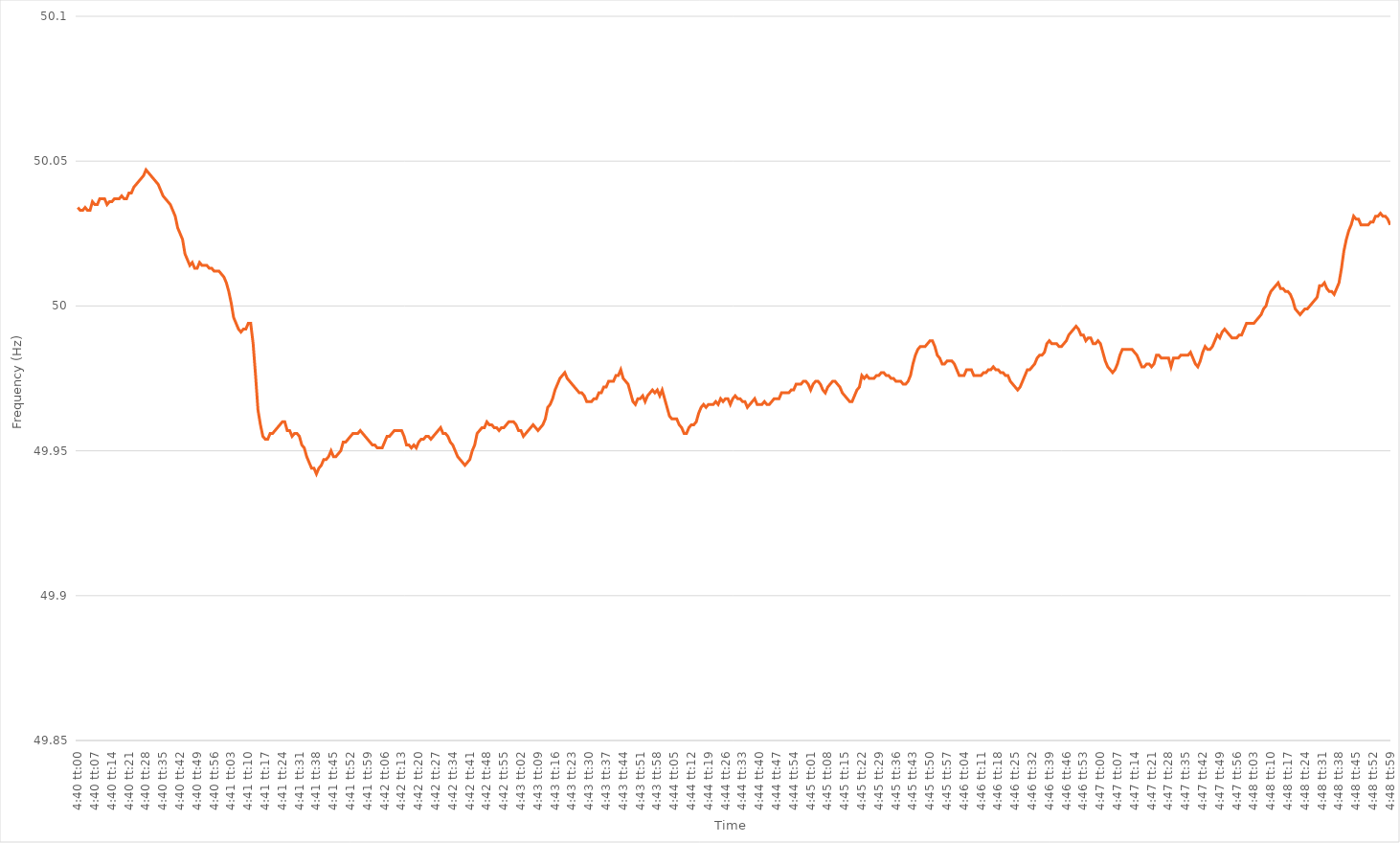
| Category | Series 0 |
|---|---|
| 0.19444444444444445 | 50.034 |
| 0.19445601851851854 | 50.033 |
| 0.19446759259259258 | 50.033 |
| 0.19447916666666668 | 50.034 |
| 0.19449074074074071 | 50.033 |
| 0.19450231481481484 | 50.033 |
| 0.19451388888888888 | 50.036 |
| 0.19452546296296294 | 50.035 |
| 0.19453703703703704 | 50.035 |
| 0.1945486111111111 | 50.037 |
| 0.19456018518518517 | 50.037 |
| 0.19457175925925926 | 50.037 |
| 0.19458333333333333 | 50.035 |
| 0.1945949074074074 | 50.036 |
| 0.1946064814814815 | 50.036 |
| 0.19461805555555556 | 50.037 |
| 0.19462962962962962 | 50.037 |
| 0.19464120370370372 | 50.037 |
| 0.19465277777777779 | 50.038 |
| 0.19466435185185185 | 50.037 |
| 0.19467592592592595 | 50.037 |
| 0.1946875 | 50.039 |
| 0.19469907407407408 | 50.039 |
| 0.19471064814814812 | 50.041 |
| 0.19472222222222224 | 50.042 |
| 0.19473379629629628 | 50.043 |
| 0.19474537037037035 | 50.044 |
| 0.19475694444444444 | 50.045 |
| 0.1947685185185185 | 50.047 |
| 0.19478009259259257 | 50.046 |
| 0.19479166666666667 | 50.045 |
| 0.19480324074074074 | 50.044 |
| 0.1948148148148148 | 50.043 |
| 0.1948263888888889 | 50.042 |
| 0.19483796296296296 | 50.04 |
| 0.19484953703703703 | 50.038 |
| 0.19486111111111112 | 50.037 |
| 0.1948726851851852 | 50.036 |
| 0.19488425925925926 | 50.035 |
| 0.19489583333333335 | 50.033 |
| 0.19490740740740742 | 50.031 |
| 0.19491898148148148 | 50.027 |
| 0.19493055555555558 | 50.025 |
| 0.19494212962962965 | 50.023 |
| 0.19495370370370368 | 50.018 |
| 0.1949652777777778 | 50.016 |
| 0.19497685185185185 | 50.014 |
| 0.1949884259259259 | 50.015 |
| 0.19499999999999998 | 50.013 |
| 0.19501157407407407 | 50.013 |
| 0.19502314814814814 | 50.015 |
| 0.1950347222222222 | 50.014 |
| 0.1950462962962963 | 50.014 |
| 0.19505787037037037 | 50.014 |
| 0.19506944444444443 | 50.013 |
| 0.19508101851851853 | 50.013 |
| 0.1950925925925926 | 50.012 |
| 0.19510416666666666 | 50.012 |
| 0.19511574074074076 | 50.012 |
| 0.19512731481481482 | 50.011 |
| 0.1951388888888889 | 50.01 |
| 0.19515046296296298 | 50.008 |
| 0.19516203703703705 | 50.005 |
| 0.1951736111111111 | 50.001 |
| 0.1951851851851852 | 49.996 |
| 0.19519675925925925 | 49.994 |
| 0.19520833333333334 | 49.992 |
| 0.19521990740740738 | 49.991 |
| 0.19523148148148148 | 49.992 |
| 0.19524305555555554 | 49.992 |
| 0.1952546296296296 | 49.994 |
| 0.1952662037037037 | 49.994 |
| 0.19527777777777777 | 49.987 |
| 0.19528935185185184 | 49.976 |
| 0.19530092592592593 | 49.964 |
| 0.1953125 | 49.959 |
| 0.19532407407407407 | 49.955 |
| 0.19533564814814816 | 49.954 |
| 0.19534722222222223 | 49.954 |
| 0.1953587962962963 | 49.956 |
| 0.1953703703703704 | 49.956 |
| 0.19538194444444446 | 49.957 |
| 0.19539351851851852 | 49.958 |
| 0.19540509259259262 | 49.959 |
| 0.19541666666666666 | 49.96 |
| 0.19542824074074075 | 49.96 |
| 0.1954398148148148 | 49.957 |
| 0.1954513888888889 | 49.957 |
| 0.19546296296296295 | 49.955 |
| 0.19547453703703702 | 49.956 |
| 0.1954861111111111 | 49.956 |
| 0.19549768518518518 | 49.955 |
| 0.19550925925925924 | 49.952 |
| 0.19552083333333334 | 49.951 |
| 0.1955324074074074 | 49.948 |
| 0.19554398148148147 | 49.946 |
| 0.19555555555555557 | 49.944 |
| 0.19556712962962963 | 49.944 |
| 0.1955787037037037 | 49.942 |
| 0.1955902777777778 | 49.944 |
| 0.19560185185185186 | 49.945 |
| 0.19561342592592593 | 49.947 |
| 0.19562500000000002 | 49.947 |
| 0.1956365740740741 | 49.948 |
| 0.19564814814814815 | 49.95 |
| 0.1956597222222222 | 49.948 |
| 0.19567129629629632 | 49.948 |
| 0.19568287037037035 | 49.949 |
| 0.19569444444444442 | 49.95 |
| 0.19570601851851852 | 49.953 |
| 0.19571759259259258 | 49.953 |
| 0.19572916666666665 | 49.954 |
| 0.19574074074074074 | 49.955 |
| 0.1957523148148148 | 49.956 |
| 0.19576388888888888 | 49.956 |
| 0.19577546296296297 | 49.956 |
| 0.19578703703703704 | 49.957 |
| 0.1957986111111111 | 49.956 |
| 0.1958101851851852 | 49.955 |
| 0.19582175925925926 | 49.954 |
| 0.19583333333333333 | 49.953 |
| 0.19584490740740743 | 49.952 |
| 0.1958564814814815 | 49.952 |
| 0.19586805555555556 | 49.951 |
| 0.19587962962962965 | 49.951 |
| 0.19589120370370372 | 49.951 |
| 0.19590277777777776 | 49.953 |
| 0.19591435185185188 | 49.955 |
| 0.19592592592592592 | 49.955 |
| 0.1959375 | 49.956 |
| 0.19594907407407405 | 49.957 |
| 0.19596064814814815 | 49.957 |
| 0.19597222222222221 | 49.957 |
| 0.19598379629629628 | 49.957 |
| 0.19599537037037038 | 49.955 |
| 0.19600694444444444 | 49.952 |
| 0.1960185185185185 | 49.952 |
| 0.1960300925925926 | 49.951 |
| 0.19604166666666667 | 49.952 |
| 0.19605324074074074 | 49.951 |
| 0.19606481481481483 | 49.953 |
| 0.1960763888888889 | 49.954 |
| 0.19608796296296296 | 49.954 |
| 0.19609953703703706 | 49.955 |
| 0.19611111111111112 | 49.955 |
| 0.19612268518518516 | 49.954 |
| 0.19613425925925929 | 49.955 |
| 0.19614583333333332 | 49.956 |
| 0.19615740740740742 | 49.957 |
| 0.19616898148148146 | 49.958 |
| 0.19618055555555555 | 49.956 |
| 0.19619212962962962 | 49.956 |
| 0.19620370370370369 | 49.955 |
| 0.19621527777777778 | 49.953 |
| 0.19622685185185185 | 49.952 |
| 0.1962384259259259 | 49.95 |
| 0.19625 | 49.948 |
| 0.19626157407407407 | 49.947 |
| 0.19627314814814814 | 49.946 |
| 0.19628472222222224 | 49.945 |
| 0.1962962962962963 | 49.946 |
| 0.19630787037037037 | 49.947 |
| 0.19631944444444446 | 49.95 |
| 0.19633101851851853 | 49.952 |
| 0.1963425925925926 | 49.956 |
| 0.1963541666666667 | 49.957 |
| 0.19636574074074073 | 49.958 |
| 0.19637731481481482 | 49.958 |
| 0.19638888888888886 | 49.96 |
| 0.19640046296296299 | 49.959 |
| 0.19641203703703702 | 49.959 |
| 0.1964236111111111 | 49.958 |
| 0.19643518518518518 | 49.958 |
| 0.19644675925925925 | 49.957 |
| 0.19645833333333332 | 49.958 |
| 0.1964699074074074 | 49.958 |
| 0.19648148148148148 | 49.959 |
| 0.19649305555555555 | 49.96 |
| 0.19650462962962964 | 49.96 |
| 0.1965162037037037 | 49.96 |
| 0.19652777777777777 | 49.959 |
| 0.19653935185185187 | 49.957 |
| 0.19655092592592593 | 49.957 |
| 0.1965625 | 49.955 |
| 0.1965740740740741 | 49.956 |
| 0.19658564814814816 | 49.957 |
| 0.19659722222222223 | 49.958 |
| 0.19660879629629627 | 49.959 |
| 0.1966203703703704 | 49.958 |
| 0.19663194444444443 | 49.957 |
| 0.1966435185185185 | 49.958 |
| 0.1966550925925926 | 49.959 |
| 0.19666666666666666 | 49.961 |
| 0.19667824074074072 | 49.965 |
| 0.19668981481481482 | 49.966 |
| 0.19670138888888888 | 49.968 |
| 0.19671296296296295 | 49.971 |
| 0.19672453703703704 | 49.973 |
| 0.1967361111111111 | 49.975 |
| 0.19674768518518518 | 49.976 |
| 0.19675925925925927 | 49.977 |
| 0.19677083333333334 | 49.975 |
| 0.1967824074074074 | 49.974 |
| 0.1967939814814815 | 49.973 |
| 0.19680555555555557 | 49.972 |
| 0.19681712962962963 | 49.971 |
| 0.19682870370370367 | 49.97 |
| 0.1968402777777778 | 49.97 |
| 0.19685185185185183 | 49.969 |
| 0.19686342592592596 | 49.967 |
| 0.196875 | 49.967 |
| 0.19688657407407406 | 49.967 |
| 0.19689814814814813 | 49.968 |
| 0.19690972222222222 | 49.968 |
| 0.1969212962962963 | 49.97 |
| 0.19693287037037036 | 49.97 |
| 0.19694444444444445 | 49.972 |
| 0.19695601851851852 | 49.972 |
| 0.19696759259259258 | 49.974 |
| 0.19697916666666668 | 49.974 |
| 0.19699074074074074 | 49.974 |
| 0.1970023148148148 | 49.976 |
| 0.1970138888888889 | 49.976 |
| 0.19702546296296297 | 49.978 |
| 0.19703703703703704 | 49.975 |
| 0.19704861111111113 | 49.974 |
| 0.1970601851851852 | 49.973 |
| 0.19707175925925924 | 49.97 |
| 0.19708333333333336 | 49.967 |
| 0.1970949074074074 | 49.966 |
| 0.1971064814814815 | 49.968 |
| 0.19711805555555553 | 49.968 |
| 0.19712962962962963 | 49.969 |
| 0.1971412037037037 | 49.967 |
| 0.19715277777777776 | 49.969 |
| 0.19716435185185185 | 49.97 |
| 0.19717592592592592 | 49.971 |
| 0.1971875 | 49.97 |
| 0.19719907407407408 | 49.971 |
| 0.19721064814814815 | 49.969 |
| 0.19722222222222222 | 49.971 |
| 0.1972337962962963 | 49.968 |
| 0.19724537037037038 | 49.965 |
| 0.19725694444444444 | 49.962 |
| 0.19726851851851854 | 49.961 |
| 0.1972800925925926 | 49.961 |
| 0.19729166666666667 | 49.961 |
| 0.19730324074074077 | 49.959 |
| 0.1973148148148148 | 49.958 |
| 0.1973263888888889 | 49.956 |
| 0.19733796296296294 | 49.956 |
| 0.19734953703703703 | 49.958 |
| 0.1973611111111111 | 49.959 |
| 0.19737268518518516 | 49.959 |
| 0.19738425925925926 | 49.96 |
| 0.19739583333333333 | 49.963 |
| 0.1974074074074074 | 49.965 |
| 0.1974189814814815 | 49.966 |
| 0.19743055555555555 | 49.965 |
| 0.19744212962962962 | 49.966 |
| 0.19745370370370371 | 49.966 |
| 0.19746527777777778 | 49.966 |
| 0.19747685185185185 | 49.967 |
| 0.19748842592592594 | 49.966 |
| 0.1975 | 49.968 |
| 0.19751157407407408 | 49.967 |
| 0.19752314814814817 | 49.968 |
| 0.19753472222222224 | 49.968 |
| 0.1975462962962963 | 49.966 |
| 0.19755787037037034 | 49.968 |
| 0.19756944444444446 | 49.969 |
| 0.1975810185185185 | 49.968 |
| 0.19759259259259257 | 49.968 |
| 0.19760416666666666 | 49.967 |
| 0.19761574074074073 | 49.967 |
| 0.1976273148148148 | 49.965 |
| 0.1976388888888889 | 49.966 |
| 0.19765046296296296 | 49.967 |
| 0.19766203703703702 | 49.968 |
| 0.19767361111111112 | 49.966 |
| 0.19768518518518519 | 49.966 |
| 0.19769675925925925 | 49.966 |
| 0.19770833333333335 | 49.967 |
| 0.1977199074074074 | 49.966 |
| 0.19773148148148148 | 49.966 |
| 0.19774305555555557 | 49.967 |
| 0.19775462962962964 | 49.968 |
| 0.1977662037037037 | 49.968 |
| 0.19777777777777775 | 49.968 |
| 0.19778935185185187 | 49.97 |
| 0.1978009259259259 | 49.97 |
| 0.19781250000000003 | 49.97 |
| 0.19782407407407407 | 49.97 |
| 0.19783564814814814 | 49.971 |
| 0.1978472222222222 | 49.971 |
| 0.1978587962962963 | 49.973 |
| 0.19787037037037036 | 49.973 |
| 0.19788194444444443 | 49.973 |
| 0.19789351851851852 | 49.974 |
| 0.1979050925925926 | 49.974 |
| 0.19791666666666666 | 49.973 |
| 0.19792824074074075 | 49.971 |
| 0.19793981481481482 | 49.973 |
| 0.19795138888888889 | 49.974 |
| 0.19796296296296298 | 49.974 |
| 0.19797453703703705 | 49.973 |
| 0.1979861111111111 | 49.971 |
| 0.1979976851851852 | 49.97 |
| 0.19800925925925927 | 49.972 |
| 0.1980208333333333 | 49.973 |
| 0.19803240740740743 | 49.974 |
| 0.19804398148148147 | 49.974 |
| 0.19805555555555557 | 49.973 |
| 0.1980671296296296 | 49.972 |
| 0.1980787037037037 | 49.97 |
| 0.19809027777777777 | 49.969 |
| 0.19810185185185183 | 49.968 |
| 0.19811342592592593 | 49.967 |
| 0.198125 | 49.967 |
| 0.19813657407407406 | 49.969 |
| 0.19814814814814816 | 49.971 |
| 0.19815972222222222 | 49.972 |
| 0.1981712962962963 | 49.976 |
| 0.19818287037037038 | 49.975 |
| 0.19819444444444445 | 49.976 |
| 0.19820601851851852 | 49.975 |
| 0.1982175925925926 | 49.975 |
| 0.19822916666666668 | 49.975 |
| 0.19824074074074075 | 49.976 |
| 0.19825231481481484 | 49.976 |
| 0.19826388888888888 | 49.977 |
| 0.19827546296296297 | 49.977 |
| 0.198287037037037 | 49.976 |
| 0.1982986111111111 | 49.976 |
| 0.19831018518518517 | 49.975 |
| 0.19832175925925924 | 49.975 |
| 0.19833333333333333 | 49.974 |
| 0.1983449074074074 | 49.974 |
| 0.19835648148148147 | 49.974 |
| 0.19836805555555556 | 49.973 |
| 0.19837962962962963 | 49.973 |
| 0.1983912037037037 | 49.974 |
| 0.1984027777777778 | 49.976 |
| 0.19841435185185186 | 49.98 |
| 0.19842592592592592 | 49.983 |
| 0.19843750000000002 | 49.985 |
| 0.19844907407407408 | 49.986 |
| 0.19846064814814815 | 49.986 |
| 0.19847222222222224 | 49.986 |
| 0.1984837962962963 | 49.987 |
| 0.19849537037037038 | 49.988 |
| 0.19850694444444442 | 49.988 |
| 0.19851851851851854 | 49.986 |
| 0.19853009259259258 | 49.983 |
| 0.19854166666666664 | 49.982 |
| 0.19855324074074074 | 49.98 |
| 0.1985648148148148 | 49.98 |
| 0.19857638888888887 | 49.981 |
| 0.19858796296296297 | 49.981 |
| 0.19859953703703703 | 49.981 |
| 0.1986111111111111 | 49.98 |
| 0.1986226851851852 | 49.978 |
| 0.19863425925925926 | 49.976 |
| 0.19864583333333333 | 49.976 |
| 0.19865740740740742 | 49.976 |
| 0.1986689814814815 | 49.978 |
| 0.19868055555555555 | 49.978 |
| 0.19869212962962965 | 49.978 |
| 0.19870370370370372 | 49.976 |
| 0.19871527777777778 | 49.976 |
| 0.19872685185185182 | 49.976 |
| 0.19873842592592594 | 49.976 |
| 0.19874999999999998 | 49.977 |
| 0.1987615740740741 | 49.977 |
| 0.19877314814814814 | 49.978 |
| 0.1987847222222222 | 49.978 |
| 0.19879629629629628 | 49.979 |
| 0.19880787037037037 | 49.978 |
| 0.19881944444444444 | 49.978 |
| 0.1988310185185185 | 49.977 |
| 0.1988425925925926 | 49.977 |
| 0.19885416666666667 | 49.976 |
| 0.19886574074074073 | 49.976 |
| 0.19887731481481483 | 49.974 |
| 0.1988888888888889 | 49.973 |
| 0.19890046296296296 | 49.972 |
| 0.19891203703703705 | 49.971 |
| 0.19892361111111112 | 49.972 |
| 0.1989351851851852 | 49.974 |
| 0.19894675925925928 | 49.976 |
| 0.19895833333333335 | 49.978 |
| 0.1989699074074074 | 49.978 |
| 0.1989814814814815 | 49.979 |
| 0.19899305555555555 | 49.98 |
| 0.19900462962962964 | 49.982 |
| 0.19901620370370368 | 49.983 |
| 0.19902777777777778 | 49.983 |
| 0.19903935185185184 | 49.984 |
| 0.1990509259259259 | 49.987 |
| 0.1990625 | 49.988 |
| 0.19907407407407407 | 49.987 |
| 0.19908564814814814 | 49.987 |
| 0.19909722222222223 | 49.987 |
| 0.1991087962962963 | 49.986 |
| 0.19912037037037036 | 49.986 |
| 0.19913194444444446 | 49.987 |
| 0.19914351851851853 | 49.988 |
| 0.1991550925925926 | 49.99 |
| 0.1991666666666667 | 49.991 |
| 0.19917824074074075 | 49.992 |
| 0.19918981481481482 | 49.993 |
| 0.19920138888888891 | 49.992 |
| 0.19921296296296295 | 49.99 |
| 0.19922453703703705 | 49.99 |
| 0.19923611111111109 | 49.988 |
| 0.19924768518518518 | 49.989 |
| 0.19925925925925925 | 49.989 |
| 0.1992708333333333 | 49.987 |
| 0.1992824074074074 | 49.987 |
| 0.19929398148148147 | 49.988 |
| 0.19930555555555554 | 49.987 |
| 0.19931712962962964 | 49.984 |
| 0.1993287037037037 | 49.981 |
| 0.19934027777777777 | 49.979 |
| 0.19935185185185186 | 49.978 |
| 0.19936342592592593 | 49.977 |
| 0.199375 | 49.978 |
| 0.1993865740740741 | 49.98 |
| 0.19939814814814816 | 49.983 |
| 0.19940972222222222 | 49.985 |
| 0.19942129629629632 | 49.985 |
| 0.19943287037037036 | 49.985 |
| 0.19944444444444445 | 49.985 |
| 0.1994560185185185 | 49.985 |
| 0.1994675925925926 | 49.984 |
| 0.19947916666666665 | 49.983 |
| 0.19949074074074072 | 49.981 |
| 0.1995023148148148 | 49.979 |
| 0.19951388888888888 | 49.979 |
| 0.19952546296296295 | 49.98 |
| 0.19953703703703704 | 49.98 |
| 0.1995486111111111 | 49.979 |
| 0.19956018518518517 | 49.98 |
| 0.19957175925925927 | 49.983 |
| 0.19958333333333333 | 49.983 |
| 0.1995949074074074 | 49.982 |
| 0.1996064814814815 | 49.982 |
| 0.19961805555555556 | 49.982 |
| 0.19962962962962963 | 49.982 |
| 0.19964120370370372 | 49.979 |
| 0.1996527777777778 | 49.982 |
| 0.19966435185185186 | 49.982 |
| 0.1996759259259259 | 49.982 |
| 0.19968750000000002 | 49.983 |
| 0.19969907407407406 | 49.983 |
| 0.19971064814814818 | 49.983 |
| 0.19972222222222222 | 49.983 |
| 0.19973379629629628 | 49.984 |
| 0.19974537037037035 | 49.982 |
| 0.19975694444444445 | 49.98 |
| 0.1997685185185185 | 49.979 |
| 0.19978009259259258 | 49.981 |
| 0.19979166666666667 | 49.984 |
| 0.19980324074074074 | 49.986 |
| 0.1998148148148148 | 49.985 |
| 0.1998263888888889 | 49.985 |
| 0.19983796296296297 | 49.986 |
| 0.19984953703703703 | 49.988 |
| 0.19986111111111113 | 49.99 |
| 0.1998726851851852 | 49.989 |
| 0.19988425925925926 | 49.991 |
| 0.19989583333333336 | 49.992 |
| 0.19990740740740742 | 49.991 |
| 0.19991898148148146 | 49.99 |
| 0.19993055555555558 | 49.989 |
| 0.19994212962962962 | 49.989 |
| 0.1999537037037037 | 49.989 |
| 0.19996527777777776 | 49.99 |
| 0.19997685185185185 | 49.99 |
| 0.19998842592592592 | 49.992 |
| 0.19999999999999998 | 49.994 |
| 0.20001157407407408 | 49.994 |
| 0.20002314814814814 | 49.994 |
| 0.2000347222222222 | 49.994 |
| 0.2000462962962963 | 49.995 |
| 0.20005787037037037 | 49.996 |
| 0.20006944444444444 | 49.997 |
| 0.20008101851851853 | 49.999 |
| 0.2000925925925926 | 50 |
| 0.20010416666666667 | 50.003 |
| 0.20011574074074076 | 50.005 |
| 0.20012731481481483 | 50.006 |
| 0.2001388888888889 | 50.007 |
| 0.200150462962963 | 50.008 |
| 0.20016203703703703 | 50.006 |
| 0.20017361111111112 | 50.006 |
| 0.20018518518518516 | 50.005 |
| 0.20019675925925925 | 50.005 |
| 0.20020833333333332 | 50.004 |
| 0.2002199074074074 | 50.002 |
| 0.20023148148148148 | 49.999 |
| 0.20024305555555555 | 49.998 |
| 0.20025462962962962 | 49.997 |
| 0.2002662037037037 | 49.998 |
| 0.20027777777777778 | 49.999 |
| 0.20028935185185184 | 49.999 |
| 0.20030092592592594 | 50 |
| 0.2003125 | 50.001 |
| 0.20032407407407407 | 50.002 |
| 0.20033564814814817 | 50.003 |
| 0.20034722222222223 | 50.007 |
| 0.2003587962962963 | 50.007 |
| 0.2003703703703704 | 50.008 |
| 0.20038194444444443 | 50.006 |
| 0.20039351851851853 | 50.005 |
| 0.20040509259259257 | 50.005 |
| 0.2004166666666667 | 50.004 |
| 0.20042824074074073 | 50.006 |
| 0.2004398148148148 | 50.008 |
| 0.2004513888888889 | 50.013 |
| 0.20046296296296295 | 50.019 |
| 0.20047453703703702 | 50.023 |
| 0.20048611111111111 | 50.026 |
| 0.20049768518518518 | 50.028 |
| 0.20050925925925925 | 50.031 |
| 0.20052083333333334 | 50.03 |
| 0.2005324074074074 | 50.03 |
| 0.20054398148148148 | 50.028 |
| 0.20055555555555557 | 50.028 |
| 0.20056712962962964 | 50.028 |
| 0.2005787037037037 | 50.028 |
| 0.2005902777777778 | 50.029 |
| 0.20060185185185186 | 50.029 |
| 0.20061342592592593 | 50.031 |
| 0.20062499999999997 | 50.031 |
| 0.2006365740740741 | 50.032 |
| 0.20064814814814813 | 50.031 |
| 0.20065972222222225 | 50.031 |
| 0.2006712962962963 | 50.03 |
| 0.20068287037037036 | 50.028 |